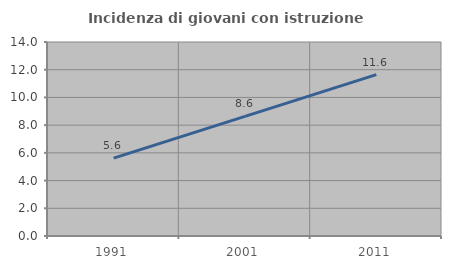
| Category | Incidenza di giovani con istruzione universitaria |
|---|---|
| 1991.0 | 5.618 |
| 2001.0 | 8.633 |
| 2011.0 | 11.647 |